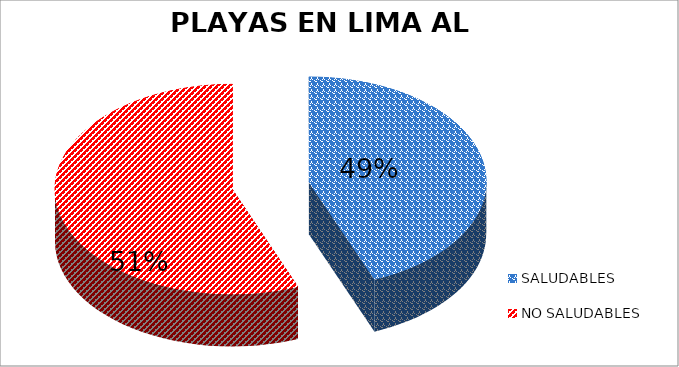
| Category | N.° |
|---|---|
| SALUDABLES | 51 |
| NO SALUDABLES | 65 |